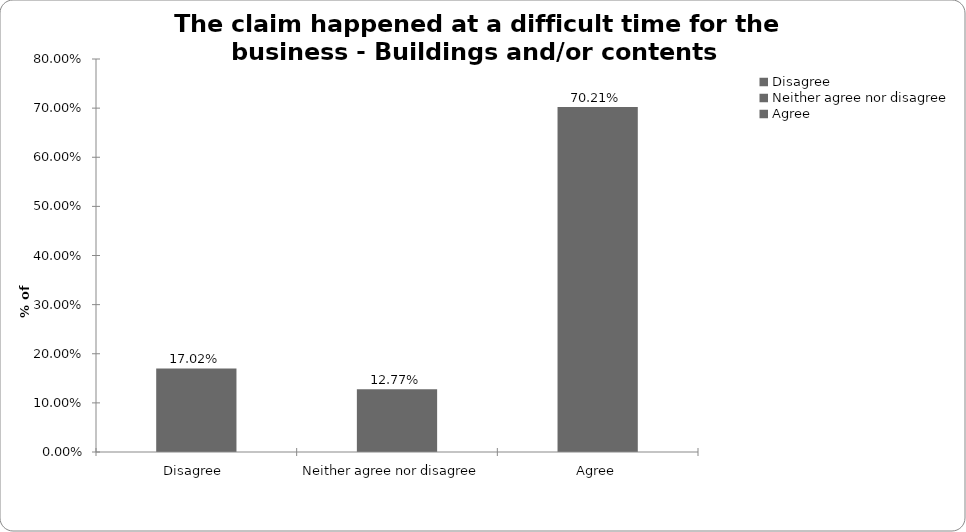
| Category | Buildings and/or conents |
|---|---|
| Disagree  | 0.17 |
| Neither agree nor disagree  | 0.128 |
| Agree | 0.702 |